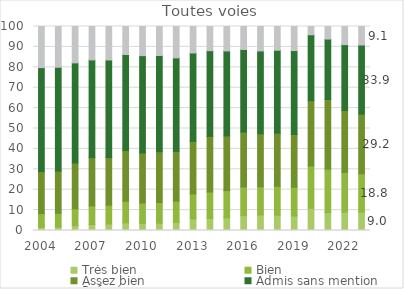
| Category | Très bien | Bien | Assez bien | Admis sans mention | Refusé |
|---|---|---|---|---|---|
| 2004 | 1.557 | 6.731 | 20.575 | 50.975 | 20.161 |
| 2005 | 1.686 | 6.791 | 20.674 | 50.883 | 19.966 |
| 2006 | 2.401 | 8.26 | 22.423 | 49.086 | 17.83 |
| 2007 | 2.941 | 9.132 | 23.669 | 47.871 | 16.388 |
| 2008 | 3.176 | 9.245 | 23.361 | 47.815 | 16.403 |
| 2009 | 3.771 | 10.604 | 24.871 | 47.03 | 13.725 |
| 2010 | 3.508 | 9.979 | 24.502 | 47.732 | 14.279 |
| 2011 | 3.595 | 10.128 | 24.923 | 47.147 | 14.207 |
| 2012 | 4.028 | 10.363 | 24.42 | 45.809 | 15.38 |
| 2013 | 5.705 | 12.242 | 25.754 | 43.323 | 12.976 |
| 2014 | 5.851 | 13.025 | 27.271 | 41.997 | 11.856 |
| 2015 | 6.193 | 13.374 | 26.808 | 41.648 | 11.976 |
| 2016 | 7.268 | 14.031 | 26.978 | 40.439 | 11.284 |
| 2017 | 7.572 | 13.881 | 25.948 | 40.609 | 11.989 |
| 2018 | 7.509 | 14.139 | 26.09 | 40.637 | 11.624 |
| 2019 | 7.126 | 14.099 | 25.835 | 41.135 | 11.804 |
| 2020 | 10.922 | 20.724 | 32.011 | 32.271 | 4.071 |
| 2021 | 8.761 | 21.326 | 34.143 | 29.623 | 6.148 |
| 2022 | 8.992 | 19.496 | 30.358 | 32.28 | 8.874 |
| 2023p | 9.043 | 18.782 | 29.239 | 33.858 | 9.078 |